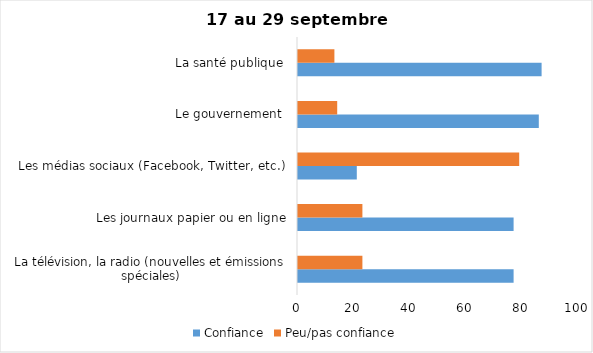
| Category | Confiance | Peu/pas confiance |
|---|---|---|
| La télévision, la radio (nouvelles et émissions spéciales) | 77 | 23 |
| Les journaux papier ou en ligne | 77 | 23 |
| Les médias sociaux (Facebook, Twitter, etc.) | 21 | 79 |
| Le gouvernement  | 86 | 14 |
| La santé publique  | 87 | 13 |